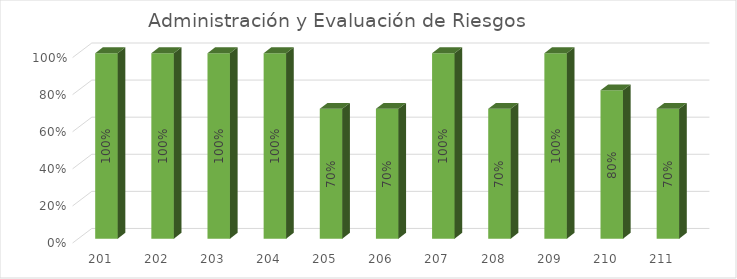
| Category | % Avance |
|---|---|
| 201.0 | 1 |
| 202.0 | 1 |
| 203.0 | 1 |
| 204.0 | 1 |
| 205.0 | 0.7 |
| 206.0 | 0.7 |
| 207.0 | 1 |
| 208.0 | 0.7 |
| 209.0 | 1 |
| 210.0 | 0.8 |
| 211.0 | 0.7 |